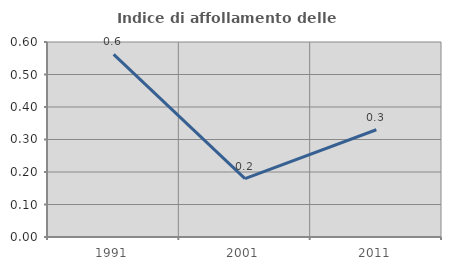
| Category | Indice di affollamento delle abitazioni  |
|---|---|
| 1991.0 | 0.562 |
| 2001.0 | 0.18 |
| 2011.0 | 0.33 |